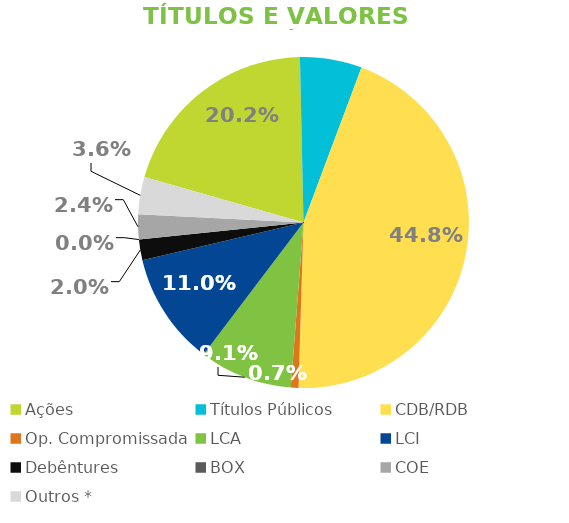
| Category | TVM |
|---|---|
| Ações | 0.202 |
| Títulos Públicos | 0.06 |
| CDB/RDB | 0.448 |
| Op. Compromissada | 0.007 |
| LCA | 0.091 |
| LCI | 0.11 |
| Debêntures | 0.02 |
| BOX | 0 |
| COE | 0.024 |
| Outros * | 0.036 |